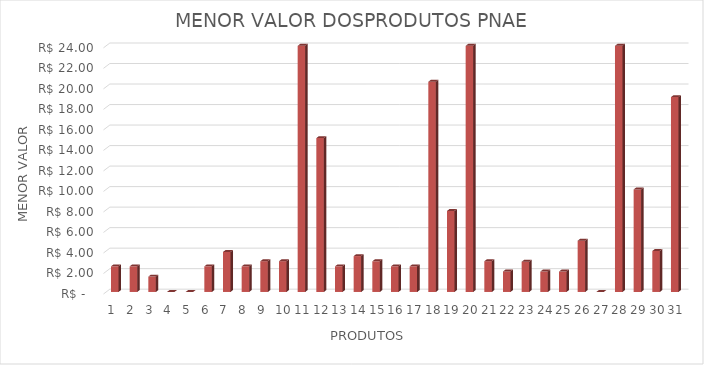
| Category | Series 0 |
|---|---|
| 0 | 2.5 |
| 1 | 2.5 |
| 2 | 1.5 |
| 3 | 0 |
| 4 | 0 |
| 5 | 2.5 |
| 6 | 3.9 |
| 7 | 2.5 |
| 8 | 3 |
| 9 | 3 |
| 10 | 24.8 |
| 11 | 15 |
| 12 | 2.5 |
| 13 | 3.5 |
| 14 | 2.99 |
| 15 | 2.5 |
| 16 | 2.5 |
| 17 | 20.5 |
| 18 | 7.9 |
| 19 | 49.95 |
| 20 | 3 |
| 21 | 2 |
| 22 | 2.95 |
| 23 | 1.99 |
| 24 | 1.99 |
| 25 | 5 |
| 26 | 0 |
| 27 | 25 |
| 28 | 10 |
| 29 | 4 |
| 30 | 19 |